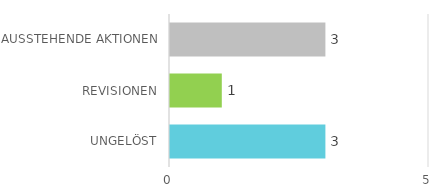
| Category | Series 1 |
|---|---|
| UNGELÖST | 3 |
| REVISIONEN | 1 |
| AUSSTEHENDE AKTIONEN | 3 |